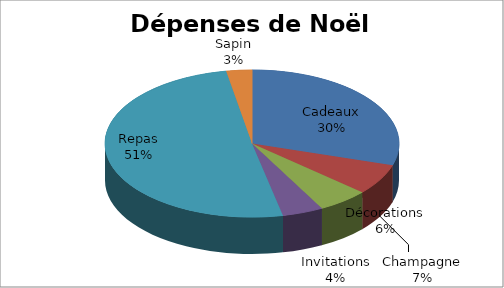
| Category | Series 0 |
|---|---|
| Cadeaux | 265 |
| Champagne | 60 |
| Décorations | 50 |
| Invitations | 40 |
| Repas | 450 |
| Sapin | 25 |